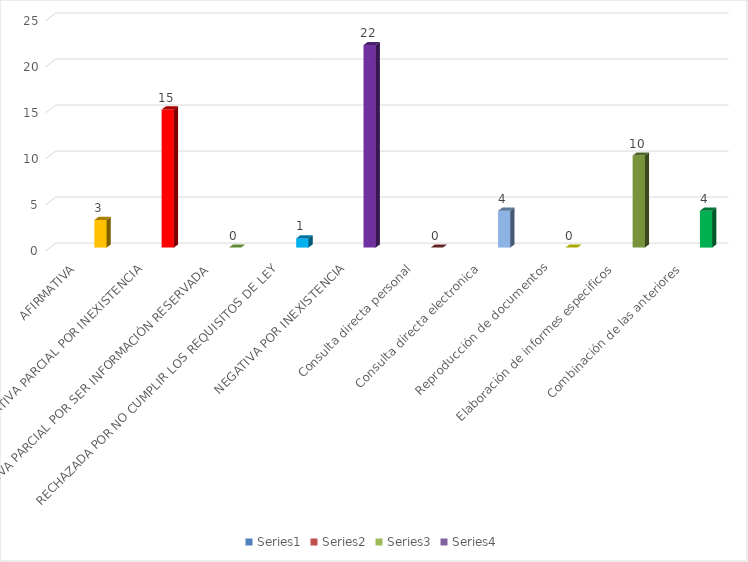
| Category | Series 0 | Series 1 | Series 2 | Series 3 |
|---|---|---|---|---|
| AFIRMATIVA |  |  |  | 3 |
| AFIRMATIVA PARCIAL POR INEXISTENCIA |  |  |  | 15 |
| AFIRMATIVA PARCIAL POR SER INFORMACIÓN RESERVADA |  |  |  | 0 |
| RECHAZADA POR NO CUMPLIR LOS REQUISITOS DE LEY |  |  |  | 1 |
| NEGATIVA POR INEXISTENCIA |  |  |  | 22 |
| Consulta directa personal |  |  |  | 0 |
| Consulta directa electronica |  |  |  | 4 |
| Reproducción de documentos |  |  |  | 0 |
| Elaboración de informes especificos |  |  |  | 10 |
| Combinación de las anteriores |  |  |  | 4 |